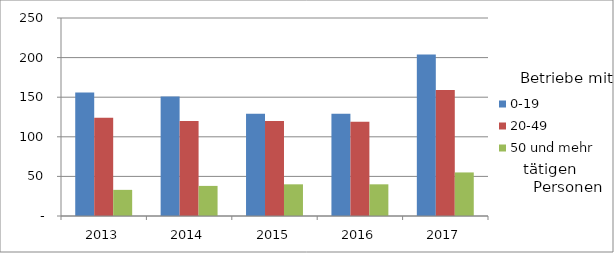
| Category | 0-19 | 20-49 | 50 und mehr |
|---|---|---|---|
| 2013.0 | 156 | 124 | 33 |
| 2014.0 | 151 | 120 | 38 |
| 2015.0 | 129 | 120 | 40 |
| 2016.0 | 129 | 119 | 40 |
| 2017.0 | 204 | 159 | 55 |